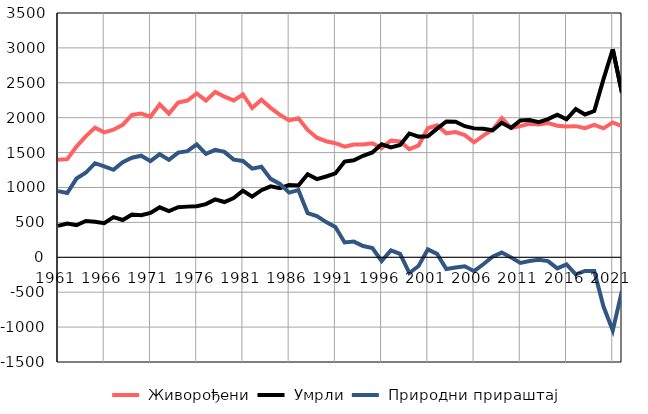
| Category |  Живорођени |  Умрли |  Природни прираштај |
|---|---|---|---|
| 1961.0 | 1399 | 451 | 948 |
| 1962.0 | 1406 | 485 | 921 |
| 1963.0 | 1587 | 459 | 1128 |
| 1964.0 | 1732 | 521 | 1211 |
| 1965.0 | 1857 | 509 | 1348 |
| 1966.0 | 1790 | 488 | 1302 |
| 1967.0 | 1828 | 575 | 1253 |
| 1968.0 | 1897 | 534 | 1363 |
| 1969.0 | 2040 | 614 | 1426 |
| 1970.0 | 2059 | 604 | 1455 |
| 1971.0 | 2013 | 635 | 1378 |
| 1972.0 | 2193 | 716 | 1477 |
| 1973.0 | 2058 | 662 | 1396 |
| 1974.0 | 2217 | 717 | 1500 |
| 1975.0 | 2246 | 726 | 1520 |
| 1976.0 | 2348 | 731 | 1617 |
| 1977.0 | 2244 | 762 | 1482 |
| 1978.0 | 2369 | 830 | 1539 |
| 1979.0 | 2302 | 792 | 1510 |
| 1980.0 | 2247 | 848 | 1399 |
| 1981.0 | 2333 | 953 | 1380 |
| 1982.0 | 2138 | 868 | 1270 |
| 1983.0 | 2258 | 961 | 1297 |
| 1984.0 | 2141 | 1017 | 1124 |
| 1985.0 | 2042 | 990 | 1052 |
| 1986.0 | 1961 | 1034 | 927 |
| 1987.0 | 1991 | 1028 | 963 |
| 1988.0 | 1825 | 1191 | 634 |
| 1989.0 | 1713 | 1121 | 592 |
| 1990.0 | 1663 | 1158 | 505 |
| 1991.0 | 1635 | 1202 | 433 |
| 1992.0 | 1584 | 1372 | 212 |
| 1993.0 | 1616 | 1391 | 225 |
| 1994.0 | 1616 | 1454 | 162 |
| 1995.0 | 1634 | 1502 | 132 |
| 1996.0 | 1565 | 1618 | -53 |
| 1997.0 | 1673 | 1573 | 100 |
| 1998.0 | 1659 | 1609 | 50 |
| 1999.0 | 1549 | 1774 | -225 |
| 2000.0 | 1604 | 1729 | -125 |
| 2001.0 | 1849 | 1735 | 114 |
| 2002.0 | 1892 | 1843 | 49 |
| 2003.0 | 1776 | 1945 | -169 |
| 2004.0 | 1795 | 1942 | -147 |
| 2005.0 | 1750 | 1878 | -128 |
| 2006.0 | 1648 | 1847 | -199 |
| 2007.0 | 1743 | 1843 | -100 |
| 2008.0 | 1829 | 1820 | 9 |
| 2009.0 | 1995 | 1927 | 68 |
| 2010.0 | 1853 | 1854 | -1 |
| 2011.0 | 1880 | 1961 | -81 |
| 2012.0 | 1912 | 1966 | -54 |
| 2013.0 | 1901 | 1937 | -36 |
| 2014.0 | 1924 | 1979 | -55 |
| 2015.0 | 1885 | 2044 | -159 |
| 2016.0 | 1873 | 1976 | -103 |
| 2017.0 | 1879 | 2124 | -245 |
| 2018.0 | 1851 | 2046 | -195 |
| 2019.0 | 1898 | 2095 | -197 |
| 2020.0 | 1847 | 2553 | -706 |
| 2021.0 | 1933 | 2981 | -1048 |
| 2022.0 | 1878 | 2356 | -478 |